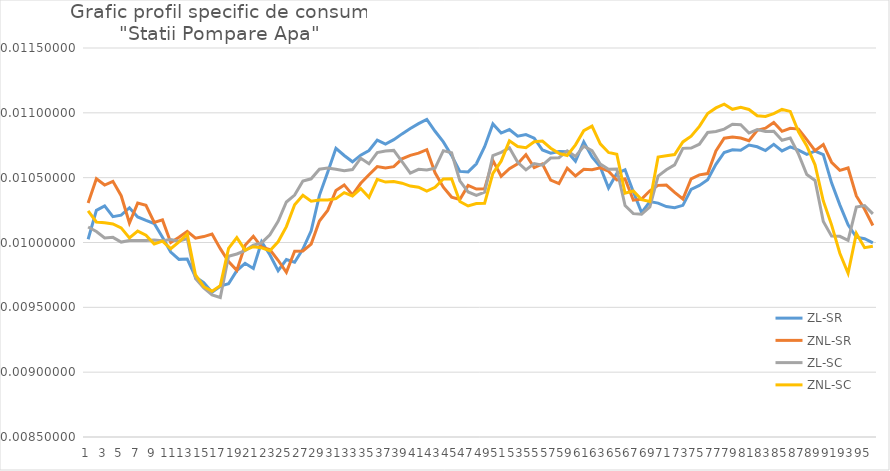
| Category | ZL-SR | ZNL-SR | ZL-SC | ZNL-SC |
|---|---|---|---|---|
| 0 | 0.01 | 0.01 | 0.01 | 0.01 |
| 1 | 0.01 | 0.01 | 0.01 | 0.01 |
| 2 | 0.01 | 0.01 | 0.01 | 0.01 |
| 3 | 0.01 | 0.01 | 0.01 | 0.01 |
| 4 | 0.01 | 0.01 | 0.01 | 0.01 |
| 5 | 0.01 | 0.01 | 0.01 | 0.01 |
| 6 | 0.01 | 0.01 | 0.01 | 0.01 |
| 7 | 0.01 | 0.01 | 0.01 | 0.01 |
| 8 | 0.01 | 0.01 | 0.01 | 0.01 |
| 9 | 0.01 | 0.01 | 0.01 | 0.01 |
| 10 | 0.01 | 0.01 | 0.01 | 0.01 |
| 11 | 0.01 | 0.01 | 0.01 | 0.01 |
| 12 | 0.01 | 0.01 | 0.01 | 0.01 |
| 13 | 0.01 | 0.01 | 0.01 | 0.01 |
| 14 | 0.01 | 0.01 | 0.01 | 0.01 |
| 15 | 0.01 | 0.01 | 0.01 | 0.01 |
| 16 | 0.01 | 0.01 | 0.01 | 0.01 |
| 17 | 0.01 | 0.01 | 0.01 | 0.01 |
| 18 | 0.01 | 0.01 | 0.01 | 0.01 |
| 19 | 0.01 | 0.01 | 0.01 | 0.01 |
| 20 | 0.01 | 0.01 | 0.01 | 0.01 |
| 21 | 0.01 | 0.01 | 0.01 | 0.01 |
| 22 | 0.01 | 0.01 | 0.01 | 0.01 |
| 23 | 0.01 | 0.01 | 0.01 | 0.01 |
| 24 | 0.01 | 0.01 | 0.01 | 0.01 |
| 25 | 0.01 | 0.01 | 0.01 | 0.01 |
| 26 | 0.01 | 0.01 | 0.01 | 0.01 |
| 27 | 0.01 | 0.01 | 0.01 | 0.01 |
| 28 | 0.01 | 0.01 | 0.011 | 0.01 |
| 29 | 0.011 | 0.01 | 0.011 | 0.01 |
| 30 | 0.011 | 0.01 | 0.011 | 0.01 |
| 31 | 0.011 | 0.01 | 0.011 | 0.01 |
| 32 | 0.011 | 0.01 | 0.011 | 0.01 |
| 33 | 0.011 | 0.01 | 0.011 | 0.01 |
| 34 | 0.011 | 0.011 | 0.011 | 0.01 |
| 35 | 0.011 | 0.011 | 0.011 | 0.01 |
| 36 | 0.011 | 0.011 | 0.011 | 0.01 |
| 37 | 0.011 | 0.011 | 0.011 | 0.01 |
| 38 | 0.011 | 0.011 | 0.011 | 0.01 |
| 39 | 0.011 | 0.011 | 0.011 | 0.01 |
| 40 | 0.011 | 0.011 | 0.011 | 0.01 |
| 41 | 0.011 | 0.011 | 0.011 | 0.01 |
| 42 | 0.011 | 0.011 | 0.011 | 0.01 |
| 43 | 0.011 | 0.01 | 0.011 | 0.01 |
| 44 | 0.011 | 0.01 | 0.011 | 0.01 |
| 45 | 0.011 | 0.01 | 0.01 | 0.01 |
| 46 | 0.011 | 0.01 | 0.01 | 0.01 |
| 47 | 0.011 | 0.01 | 0.01 | 0.01 |
| 48 | 0.011 | 0.01 | 0.01 | 0.01 |
| 49 | 0.011 | 0.011 | 0.011 | 0.011 |
| 50 | 0.011 | 0.011 | 0.011 | 0.011 |
| 51 | 0.011 | 0.011 | 0.011 | 0.011 |
| 52 | 0.011 | 0.011 | 0.011 | 0.011 |
| 53 | 0.011 | 0.011 | 0.011 | 0.011 |
| 54 | 0.011 | 0.011 | 0.011 | 0.011 |
| 55 | 0.011 | 0.011 | 0.011 | 0.011 |
| 56 | 0.011 | 0.01 | 0.011 | 0.011 |
| 57 | 0.011 | 0.01 | 0.011 | 0.011 |
| 58 | 0.011 | 0.011 | 0.011 | 0.011 |
| 59 | 0.011 | 0.011 | 0.011 | 0.011 |
| 60 | 0.011 | 0.011 | 0.011 | 0.011 |
| 61 | 0.011 | 0.011 | 0.011 | 0.011 |
| 62 | 0.011 | 0.011 | 0.011 | 0.011 |
| 63 | 0.01 | 0.011 | 0.011 | 0.011 |
| 64 | 0.011 | 0.01 | 0.011 | 0.011 |
| 65 | 0.011 | 0.01 | 0.01 | 0.01 |
| 66 | 0.01 | 0.01 | 0.01 | 0.01 |
| 67 | 0.01 | 0.01 | 0.01 | 0.01 |
| 68 | 0.01 | 0.01 | 0.01 | 0.01 |
| 69 | 0.01 | 0.01 | 0.011 | 0.011 |
| 70 | 0.01 | 0.01 | 0.011 | 0.011 |
| 71 | 0.01 | 0.01 | 0.011 | 0.011 |
| 72 | 0.01 | 0.01 | 0.011 | 0.011 |
| 73 | 0.01 | 0.01 | 0.011 | 0.011 |
| 74 | 0.01 | 0.011 | 0.011 | 0.011 |
| 75 | 0.01 | 0.011 | 0.011 | 0.011 |
| 76 | 0.011 | 0.011 | 0.011 | 0.011 |
| 77 | 0.011 | 0.011 | 0.011 | 0.011 |
| 78 | 0.011 | 0.011 | 0.011 | 0.011 |
| 79 | 0.011 | 0.011 | 0.011 | 0.011 |
| 80 | 0.011 | 0.011 | 0.011 | 0.011 |
| 81 | 0.011 | 0.011 | 0.011 | 0.011 |
| 82 | 0.011 | 0.011 | 0.011 | 0.011 |
| 83 | 0.011 | 0.011 | 0.011 | 0.011 |
| 84 | 0.011 | 0.011 | 0.011 | 0.011 |
| 85 | 0.011 | 0.011 | 0.011 | 0.011 |
| 86 | 0.011 | 0.011 | 0.011 | 0.011 |
| 87 | 0.011 | 0.011 | 0.011 | 0.011 |
| 88 | 0.011 | 0.011 | 0.01 | 0.011 |
| 89 | 0.011 | 0.011 | 0.01 | 0.01 |
| 90 | 0.01 | 0.011 | 0.01 | 0.01 |
| 91 | 0.01 | 0.011 | 0.01 | 0.01 |
| 92 | 0.01 | 0.011 | 0.01 | 0.01 |
| 93 | 0.01 | 0.01 | 0.01 | 0.01 |
| 94 | 0.01 | 0.01 | 0.01 | 0.01 |
| 95 | 0.01 | 0.01 | 0.01 | 0.01 |